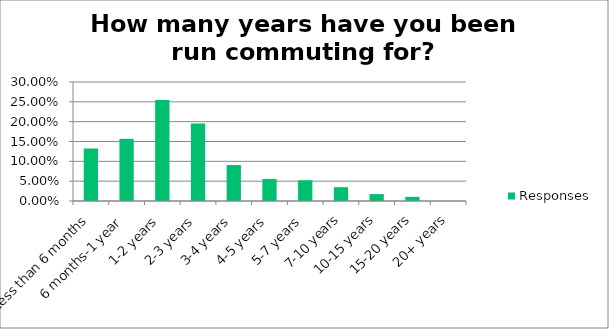
| Category | Responses |
|---|---|
| Less than 6 months | 0.132 |
| 6 months-1 year | 0.157 |
| 1-2 years | 0.254 |
| 2-3 years | 0.195 |
| 3-4 years | 0.091 |
| 4-5 years | 0.056 |
| 5-7 years | 0.052 |
| 7-10 years | 0.035 |
| 10-15 years | 0.017 |
| 15-20 years | 0.01 |
| 20+ years | 0 |